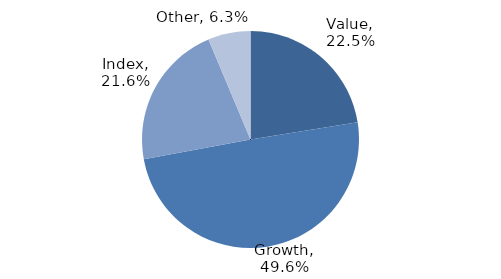
| Category | Investment Style |
|---|---|
| Value | 0.225 |
| Growth | 0.496 |
| Index | 0.216 |
| Other | 0.063 |